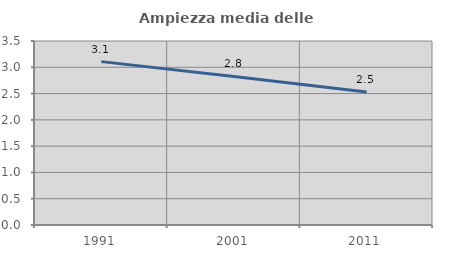
| Category | Ampiezza media delle famiglie |
|---|---|
| 1991.0 | 3.108 |
| 2001.0 | 2.826 |
| 2011.0 | 2.528 |